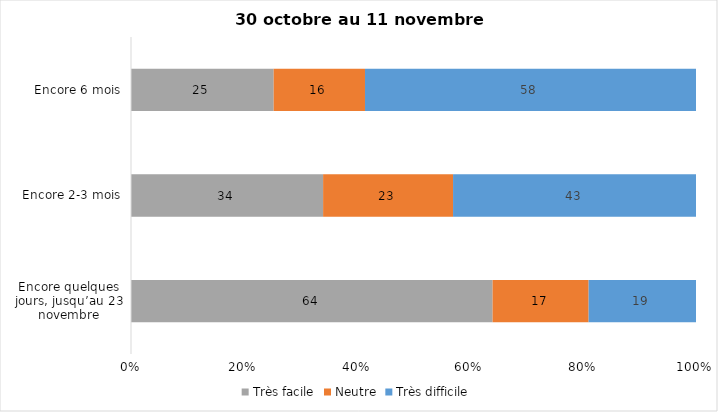
| Category | Très facile | Neutre | Très difficile |
|---|---|---|---|
| Encore quelques jours, jusqu’au 23 novembre | 64 | 17 | 19 |
| Encore 2-3 mois | 34 | 23 | 43 |
| Encore 6 mois | 25 | 16 | 58 |